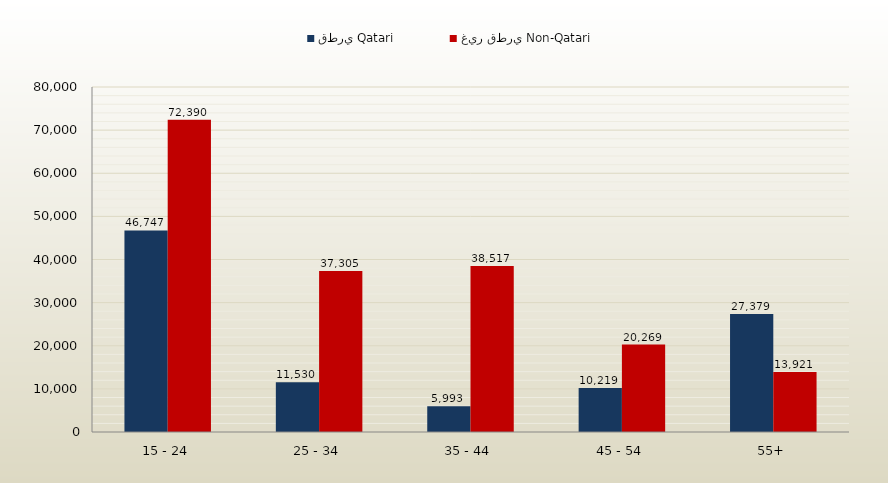
| Category | قطري Qatari | غير قطري Non-Qatari |
|---|---|---|
| 15 - 24 | 46747 | 72390 |
| 25 - 34 | 11530 | 37305 |
| 35 - 44 | 5993 | 38517 |
| 45 - 54 | 10219 | 20269 |
| 55+ | 27379 | 13921 |